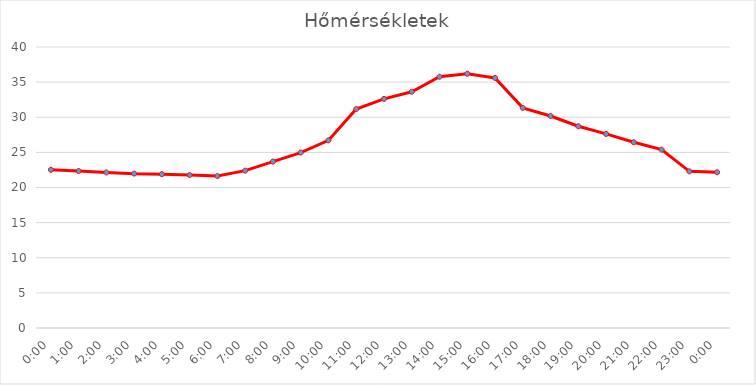
| Category | Series 0 |
|---|---|
| 0.0 | 22.513 |
| 0.041666666666666664 | 22.346 |
| 0.0833333333333333 | 22.142 |
| 0.125 | 21.974 |
| 0.166666666666667 | 21.899 |
| 0.208333333333333 | 21.765 |
| 0.25 | 21.632 |
| 0.291666666666667 | 22.396 |
| 0.333333333333333 | 23.685 |
| 0.375 | 24.974 |
| 0.416666666666667 | 26.716 |
| 0.458333333333333 | 31.176 |
| 0.5 | 32.612 |
| 0.541666666666667 | 33.632 |
| 0.583333333333333 | 35.763 |
| 0.625 | 36.199 |
| 0.666666666666667 | 35.596 |
| 0.708333333333333 | 31.332 |
| 0.75 | 30.174 |
| 0.791666666666667 | 28.715 |
| 0.833333333333333 | 27.626 |
| 0.875 | 26.437 |
| 0.916666666666667 | 25.385 |
| 0.958333333333333 | 22.296 |
| 1900-01-01 | 22.174 |